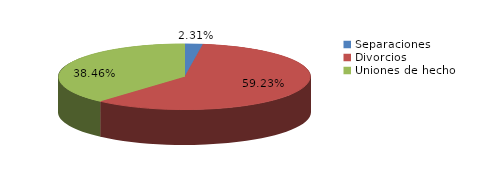
| Category | Series 0 |
|---|---|
| Separaciones | 3 |
| Divorcios | 77 |
| Uniones de hecho | 50 |